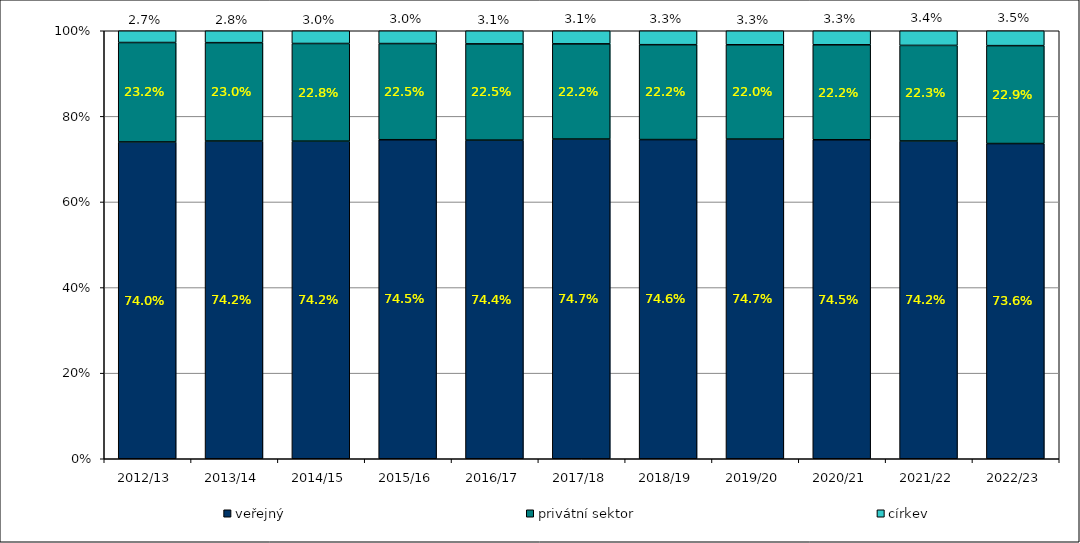
| Category | veřejný | privátní sektor | církev |
|---|---|---|---|
| 2012/13 | 0.74 | 0.232 | 0.027 |
| 2013/14 | 0.742 | 0.23 | 0.028 |
| 2014/15 | 0.742 | 0.228 | 0.03 |
| 2015/16 | 0.745 | 0.225 | 0.03 |
| 2016/17 | 0.744 | 0.225 | 0.031 |
| 2017/18 | 0.747 | 0.222 | 0.031 |
| 2018/19 | 0.746 | 0.222 | 0.033 |
| 2019/20 | 0.747 | 0.22 | 0.033 |
| 2020/21 | 0.745 | 0.222 | 0.033 |
| 2021/22 | 0.742 | 0.223 | 0.034 |
| 2022/23 | 0.736 | 0.229 | 0.035 |